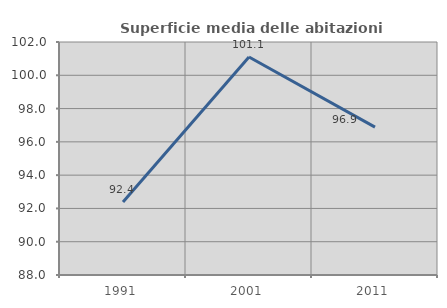
| Category | Superficie media delle abitazioni occupate |
|---|---|
| 1991.0 | 92.38 |
| 2001.0 | 101.099 |
| 2011.0 | 96.883 |